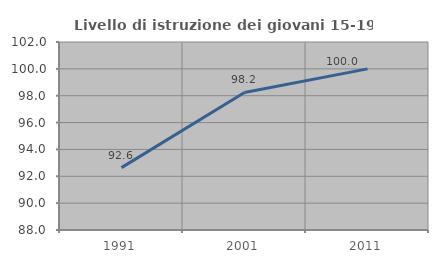
| Category | Livello di istruzione dei giovani 15-19 anni |
|---|---|
| 1991.0 | 92.647 |
| 2001.0 | 98.246 |
| 2011.0 | 100 |